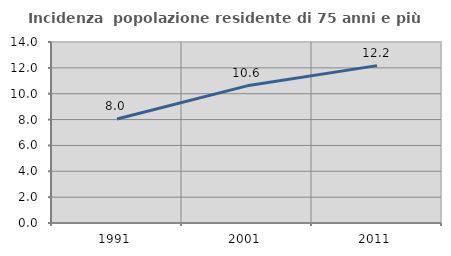
| Category | Incidenza  popolazione residente di 75 anni e più |
|---|---|
| 1991.0 | 8.041 |
| 2001.0 | 10.61 |
| 2011.0 | 12.171 |